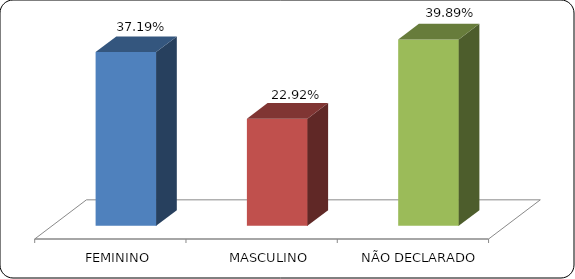
| Category | Series 0 |
|---|---|
|      FEMININO | 0.372 |
|      MASCULINO | 0.229 |
|      NÃO DECLARADO | 0.399 |